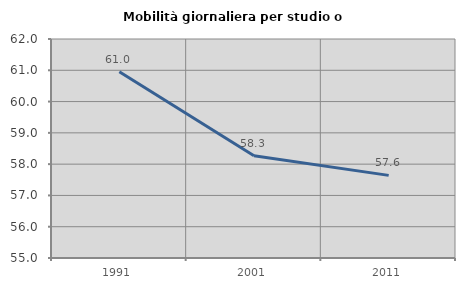
| Category | Mobilità giornaliera per studio o lavoro |
|---|---|
| 1991.0 | 60.954 |
| 2001.0 | 58.268 |
| 2011.0 | 57.641 |